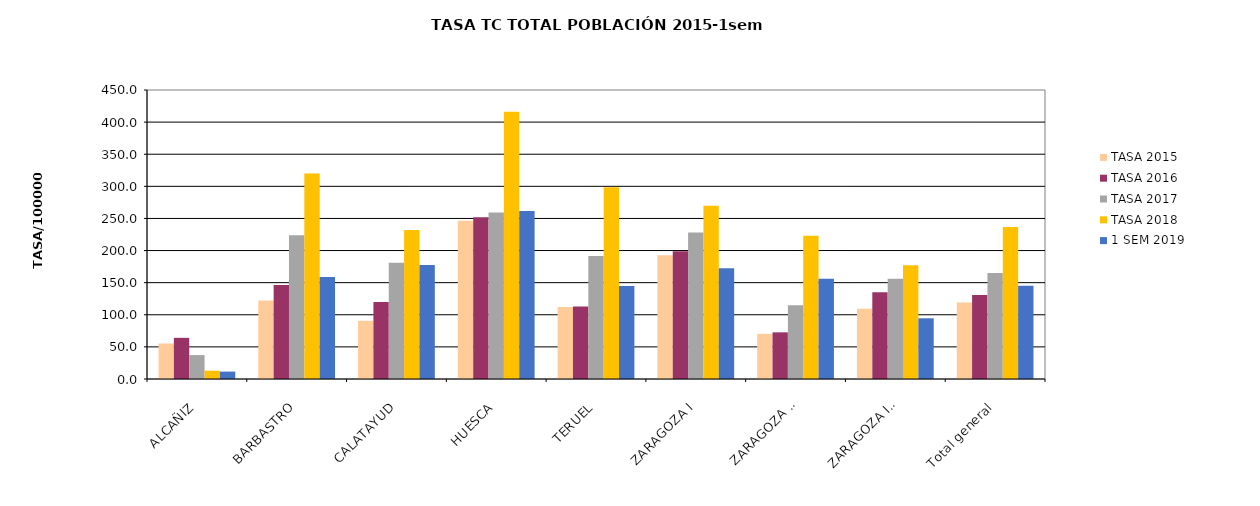
| Category | TASA 2015 | TASA 2016 | TASA 2017 | TASA 2018 | 1 SEM 2019 |
|---|---|---|---|---|---|
| ALCAÑIZ | 55.293 | 64.109 | 37.21 | 12.927 | 11.534 |
| BARBASTRO | 122.409 | 146.227 | 223.944 | 320.021 | 158.868 |
| CALATAYUD | 90.603 | 120.059 | 181.011 | 231.843 | 177.624 |
| HUESCA | 246.407 | 252.047 | 259.07 | 415.961 | 261.619 |
| TERUEL | 112.041 | 112.908 | 191.424 | 298.761 | 144.91 |
| ZARAGOZA I | 192.507 | 199.097 | 228.258 | 269.835 | 172.539 |
| ZARAGOZA II | 70.339 | 72.665 | 115.01 | 222.932 | 155.954 |
| ZARAGOZA III | 109.464 | 134.94 | 156.074 | 177.105 | 94.552 |
| Total general | 119.254 | 130.792 | 165.15 | 236.534 | 145.355 |